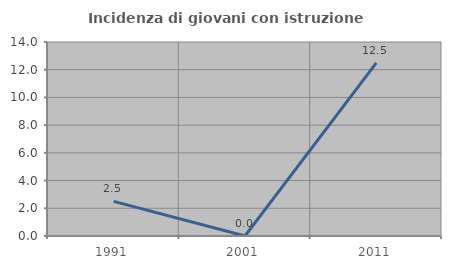
| Category | Incidenza di giovani con istruzione universitaria |
|---|---|
| 1991.0 | 2.5 |
| 2001.0 | 0 |
| 2011.0 | 12.5 |